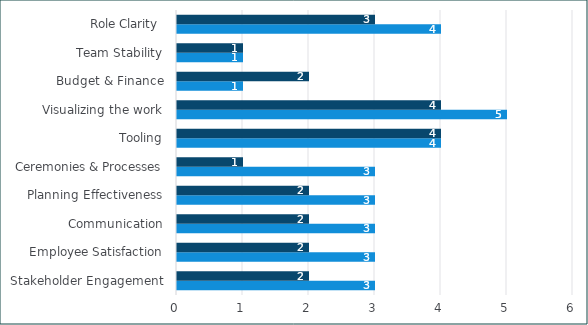
| Category | Series 2 | Series 0 |
|---|---|---|
| Stakeholder Engagement | 3 | 2 |
| Employee Satisfaction | 3 | 2 |
| Communication | 3 | 2 |
| Planning Effectiveness | 3 | 2 |
| Ceremonies & Processes | 3 | 1 |
| Tooling | 4 | 4 |
| Visualizing the work | 5 | 4 |
| Budget & Finance | 1 | 2 |
| Team Stability | 1 | 1 |
| Role Clarity  | 4 | 3 |